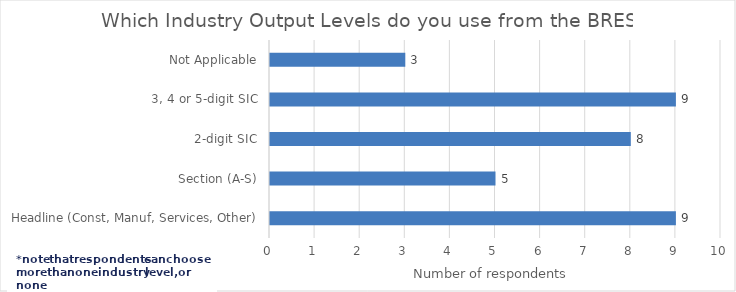
| Category | 10 |
|---|---|
| Headline (Const, Manuf, Services, Other) | 9 |
| Section (A-S) | 5 |
| 2-digit SIC | 8 |
| 3, 4 or 5-digit SIC | 9 |
| Not Applicable | 3 |